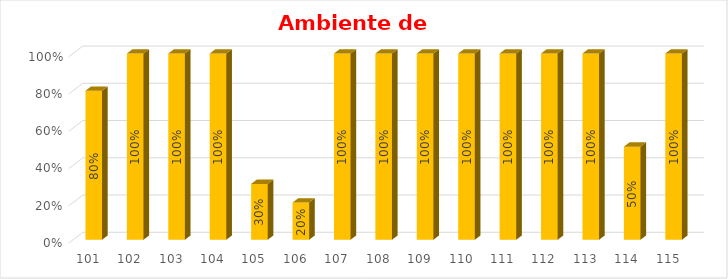
| Category | % Avance |
|---|---|
| 101.0 | 0.8 |
| 102.0 | 1 |
| 103.0 | 1 |
| 104.0 | 1 |
| 105.0 | 0.3 |
| 106.0 | 0.2 |
| 107.0 | 1 |
| 108.0 | 1 |
| 109.0 | 1 |
| 110.0 | 1 |
| 111.0 | 1 |
| 112.0 | 1 |
| 113.0 | 1 |
| 114.0 | 0.5 |
| 115.0 | 1 |